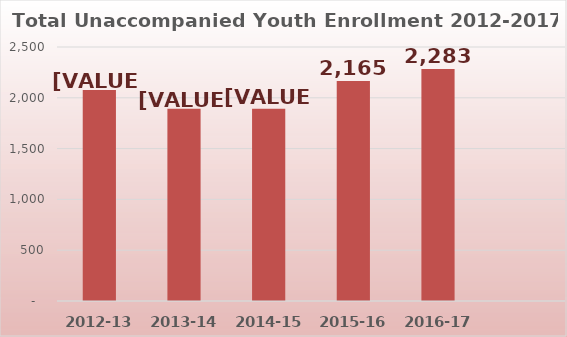
| Category | Unaccompanied Youth |
|---|---|
| 2012-13 | 2078 |
| 2013-14 | 1892 |
| 2014-15 | 1891 |
| 2015-16 | 2165 |
| 2016-17 | 2283 |